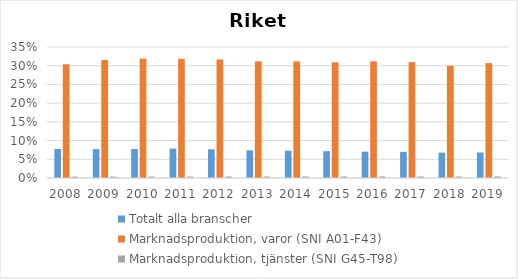
| Category | Totalt alla branscher | Marknadsproduktion, varor (SNI A01-F43) | Marknadsproduktion, tjänster (SNI G45-T98) |
|---|---|---|---|
| 2008.0 | 0.078 | 0.304 | 0.004 |
| 2009.0 | 0.077 | 0.315 | 0.004 |
| 2010.0 | 0.077 | 0.319 | 0.004 |
| 2011.0 | 0.078 | 0.318 | 0.004 |
| 2012.0 | 0.077 | 0.317 | 0.004 |
| 2013.0 | 0.074 | 0.312 | 0.004 |
| 2014.0 | 0.073 | 0.311 | 0.004 |
| 2015.0 | 0.072 | 0.309 | 0.004 |
| 2016.0 | 0.07 | 0.312 | 0.004 |
| 2017.0 | 0.07 | 0.31 | 0.004 |
| 2018.0 | 0.068 | 0.3 | 0.004 |
| 2019.0 | 0.068 | 0.307 | 0.004 |